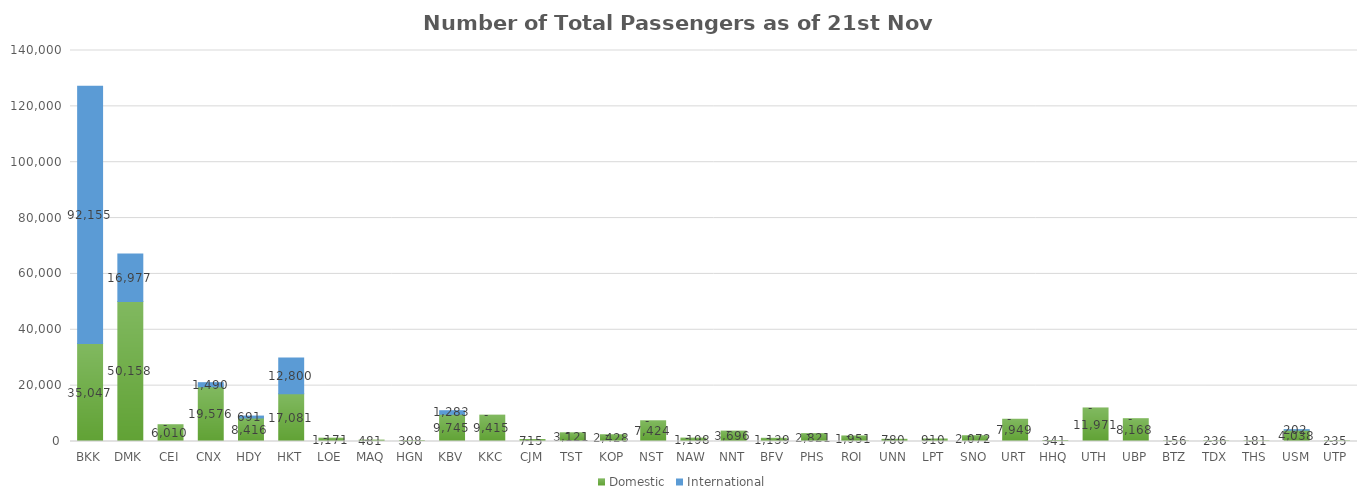
| Category | Domestic | International |
|---|---|---|
| BKK | 35047 | 92155 |
| DMK | 50158 | 16977 |
| CEI | 6010 | 0 |
| CNX | 19576 | 1490 |
| HDY | 8416 | 691 |
| HKT | 17081 | 12800 |
| LOE | 1171 | 0 |
| MAQ | 481 | 0 |
| HGN | 308 | 0 |
| KBV | 9745 | 1283 |
| KKC | 9415 | 0 |
| CJM | 715 | 0 |
| TST | 3121 | 0 |
| KOP | 2428 | 0 |
| NST | 7424 | 0 |
| NAW | 1198 | 0 |
| NNT | 3696 | 0 |
| BFV | 1139 | 0 |
| PHS | 2821 | 0 |
| ROI | 1951 | 0 |
| UNN | 780 | 0 |
| LPT | 910 | 0 |
| SNO | 2072 | 0 |
| URT | 7949 | 0 |
| HHQ | 341 | 0 |
| UTH | 11971 | 0 |
| UBP | 8168 | 0 |
| BTZ | 156 | 0 |
| TDX | 236 | 0 |
| THS | 181 | 0 |
| USM | 4038 | 202 |
| UTP | 235 | 0 |